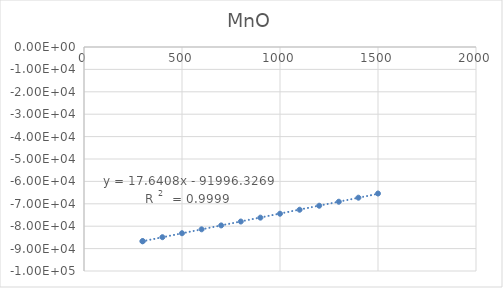
| Category | Series 0 |
|---|---|
| 298.15 | -86719.6 |
| 300.0 | -86686.4 |
| 400.0 | -84904 |
| 500.0 | -83140.9 |
| 600.0 | -81391.2 |
| 700.0 | -79650.4 |
| 800.0 | -77914.7 |
| 900.0 | -76181.3 |
| 1000.0 | -74437.1 |
| 1100.0 | -72649.6 |
| 1200.0 | -70862.7 |
| 1300.0 | -69075 |
| 1400.0 | -67270.2 |
| 1500.0 | -65408.3 |